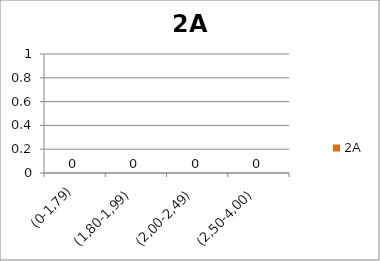
| Category | 2A |
|---|---|
| (0-1,79) | 0 |
| (1,80-1,99) | 0 |
| (2,00-2,49) | 0 |
| (2,50-4,00) | 0 |